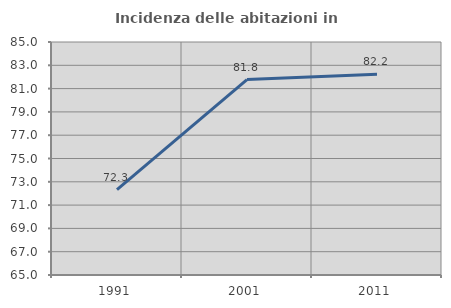
| Category | Incidenza delle abitazioni in proprietà  |
|---|---|
| 1991.0 | 72.326 |
| 2001.0 | 81.778 |
| 2011.0 | 82.241 |